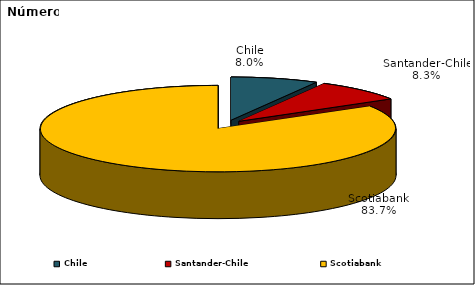
| Category | N° de Contratos |
|---|---|
| Chile | 0.08 |
| Santander-Chile | 0.083 |
| Scotiabank | 0.837 |